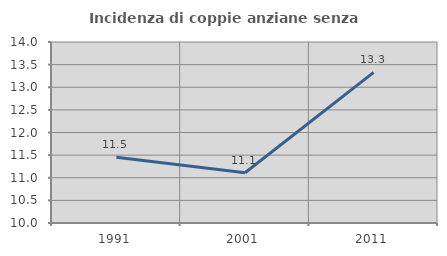
| Category | Incidenza di coppie anziane senza figli  |
|---|---|
| 1991.0 | 11.451 |
| 2001.0 | 11.111 |
| 2011.0 | 13.327 |